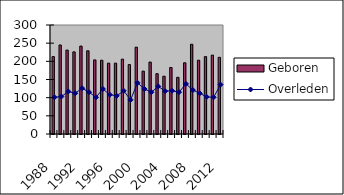
| Category | Geboren |
|---|---|
| 1988.0 | 213 |
| 1989.0 | 245 |
| 1990.0 | 231 |
| 1991.0 | 226 |
| 1992.0 | 242 |
| 1993.0 | 229 |
| 1994.0 | 204 |
| 1995.0 | 203 |
| 1996.0 | 195 |
| 1997.0 | 195 |
| 1998.0 | 206 |
| 1999.0 | 191 |
| 2000.0 | 239 |
| 2001.0 | 173 |
| 2002.0 | 198 |
| 2003.0 | 166 |
| 2004.0 | 159 |
| 2005.0 | 183 |
| 2006.0 | 156 |
| 2007.0 | 196 |
| 2008.0 | 247 |
| 2009.0 | 203 |
| 2010.0 | 213 |
| 2011.0 | 217 |
| 2012.0 | 211 |